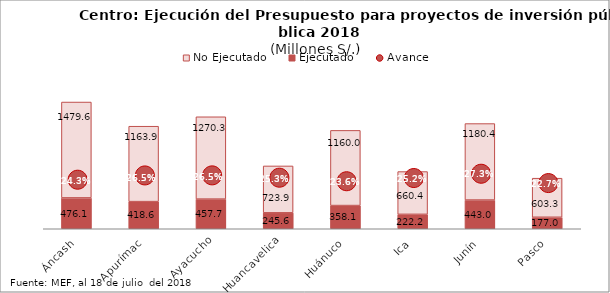
| Category | Ejecutado | No Ejecutado |
|---|---|---|
| Áncash | 476.106 | 1479.642 |
| Apurímac | 418.582 | 1163.885 |
| Ayacucho | 457.652 | 1270.293 |
| Huancavelica | 245.58 | 723.927 |
| Huánuco | 358.068 | 1160.042 |
| Ica | 222.171 | 660.407 |
| Junín | 443.012 | 1180.408 |
| Pasco | 176.999 | 603.327 |